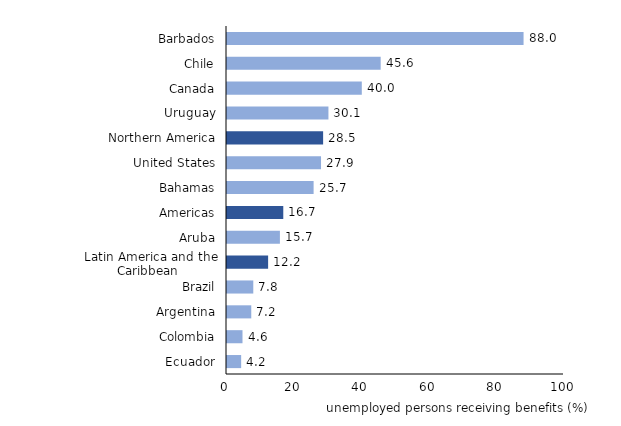
| Category | Series 0 |
|---|---|
| Ecuador | 4.2 |
| Colombia | 4.6 |
| Argentina | 7.2 |
| Brazil | 7.8 |
|  Latin America and the Caribbean | 12.202 |
| Aruba | 15.7 |
| Americas | 16.7 |
| Bahamas | 25.7 |
| United States | 27.9 |
|  Northern America | 28.524 |
| Uruguay | 30.1 |
| Canada | 40 |
| Chile | 45.6 |
| Barbados | 88 |